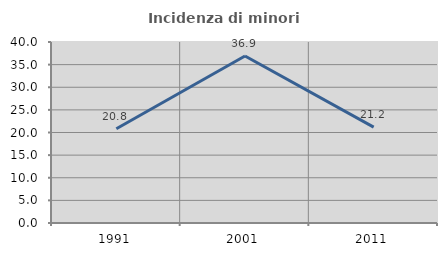
| Category | Incidenza di minori stranieri |
|---|---|
| 1991.0 | 20.833 |
| 2001.0 | 36.905 |
| 2011.0 | 21.186 |